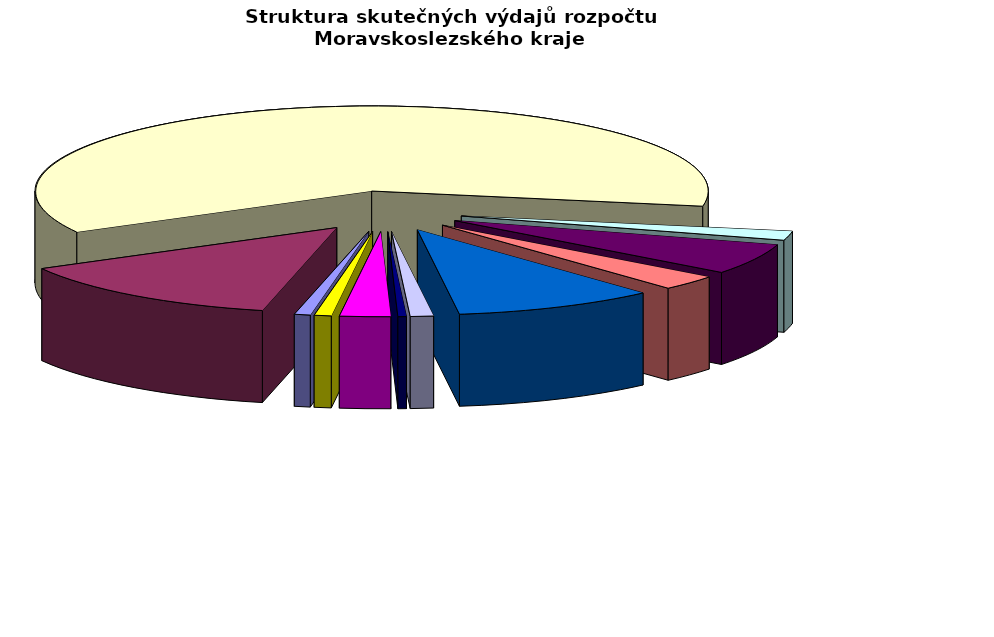
| Category | Series 0 |
|---|---|
| Regionální rozvoj | 185849.803 |
| Doprava a chytrý region | 3246553.355 |
| Školství | 14697233.333 |
| Kultura | 421572.514 |
| Zdravotnictví | 1409885.781 |
| Životní prostředí | 690805.452 |
| Sociální věci | 2342195.182 |
| Krizové řízení | 268164.537 |
| Cestovní ruch | 98110.852 |
| Všeobecná veřejná správa a služby | 589166.387 |
| Ostatní | 197465.394 |